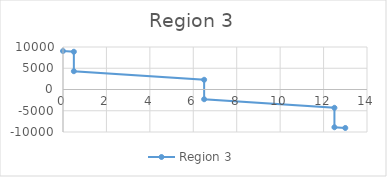
| Category | Region 3 |
|---|---|
| 0.0 | 9048.507 |
| 0.5 | 8880.267 |
| 0.5 | 4306.009 |
| 6.5 | 2287.129 |
| 6.5 | -2287.129 |
| 12.5 | -4306.009 |
| 12.5 | -8880.267 |
| 13.0 | -9048.507 |